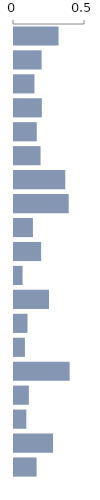
| Category | Score |
|---|---|
| 0 | 0.314 |
| 1 | 0.194 |
| 2 | 0.144 |
| 3 | 0.196 |
| 4 | 0.16 |
| 5 | 0.187 |
| 6 | 0.361 |
| 7 | 0.385 |
| 8 | 0.133 |
| 9 | 0.191 |
| 10 | 0.06 |
| 11 | 0.246 |
| 12 | 0.095 |
| 13 | 0.077 |
| 14 | 0.392 |
| 15 | 0.105 |
| 16 | 0.087 |
| 17 | 0.275 |
| 18 | 0.159 |